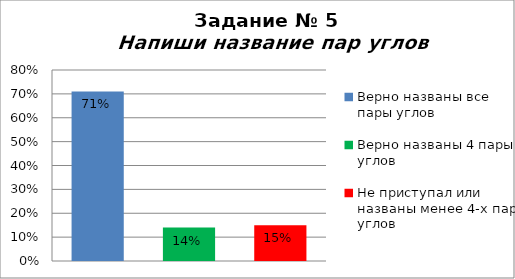
| Category | Напиши название пар углов |
|---|---|
| Верно названы все пары углов | 0.71 |
| Верно названы 4 пары углов | 0.14 |
| Не приступал или названы менее 4-х пар углов | 0.15 |